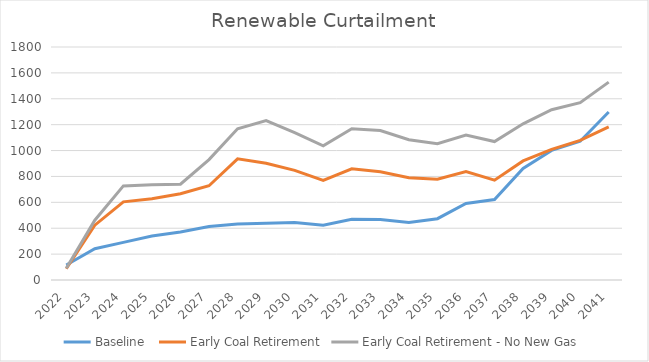
| Category | Baseline  | Early Coal Retirement | Early Coal Retirement - No New Gas |
|---|---|---|---|
| 2022.0 | 115.357 | 87.28 | 90.218 |
| 2023.0 | 241.476 | 423.358 | 461.984 |
| 2024.0 | 290.895 | 603.495 | 727.089 |
| 2025.0 | 339.481 | 627.636 | 736.015 |
| 2026.0 | 370.885 | 666.166 | 739.975 |
| 2027.0 | 413.687 | 728.023 | 930.537 |
| 2028.0 | 432.976 | 935.784 | 1168.117 |
| 2029.0 | 437.551 | 902.534 | 1230.99 |
| 2030.0 | 444.196 | 847.3 | 1138.237 |
| 2031.0 | 422.888 | 769.673 | 1036.23 |
| 2032.0 | 468.503 | 858.623 | 1168.121 |
| 2033.0 | 466.934 | 836.564 | 1155.012 |
| 2034.0 | 443.964 | 790.337 | 1083.794 |
| 2035.0 | 473.653 | 778.404 | 1052.266 |
| 2036.0 | 591.281 | 837.032 | 1119.233 |
| 2037.0 | 621.093 | 770.868 | 1069.336 |
| 2038.0 | 861.288 | 919.707 | 1206.705 |
| 2039.0 | 1001.354 | 1009.692 | 1315.639 |
| 2040.0 | 1071.601 | 1079.039 | 1369.614 |
| 2041.0 | 1298.03 | 1182.801 | 1528.78 |